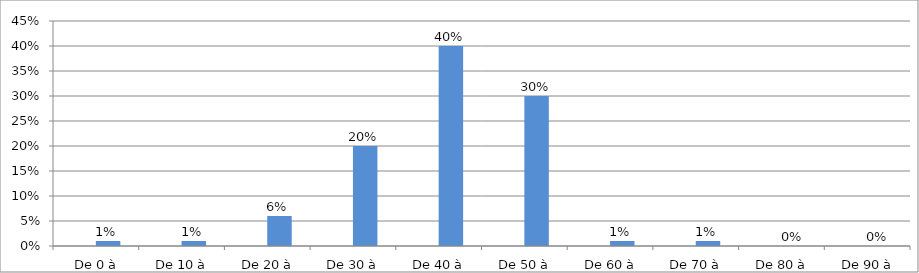
| Category | Series 0 | Series 1 |
|---|---|---|
| De 0 à 9,9% |  | 0.01 |
| De 10 à 19,9 % |  | 0.01 |
| De 20 à 29,9 % |  | 0.06 |
| De 30 à 39,9 % |  | 0.2 |
| De 40 à 49,9 % |  | 0.4 |
| De 50 à 59,9 % |  | 0.3 |
| De 60 à 69,9 % |  | 0.01 |
| De 70 à 79,9 % |  | 0.01 |
| De 80 à 89,9 % |  | 0 |
| De 90 à 100 % |  | 0 |